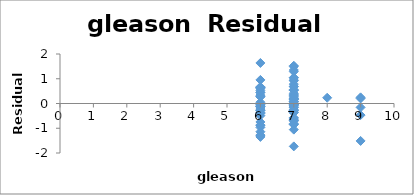
| Category | Series 0 |
|---|---|
| 6.0 | -1.305 |
| 6.0 | -0.887 |
| 7.0 | -0.706 |
| 6.0 | -0.747 |
| 6.0 | -1.35 |
| 6.0 | -0.042 |
| 6.0 | -1.141 |
| 6.0 | -1.273 |
| 6.0 | -0.12 |
| 6.0 | -0.259 |
| 6.0 | -0.182 |
| 6.0 | 0.437 |
| 7.0 | -0.853 |
| 7.0 | -0.572 |
| 7.0 | -0.659 |
| 6.0 | -0.491 |
| 7.0 | 0.173 |
| 6.0 | -0.966 |
| 6.0 | 0.27 |
| 6.0 | -0.135 |
| 6.0 | -0.368 |
| 7.0 | -1.055 |
| 6.0 | 0.639 |
| 7.0 | -0.843 |
| 6.0 | -0.064 |
| 6.0 | -0.286 |
| 7.0 | -0.153 |
| 7.0 | 0.194 |
| 7.0 | -0.235 |
| 6.0 | -0.399 |
| 6.0 | -0.06 |
| 6.0 | -0.867 |
| 6.0 | 0.051 |
| 6.0 | 0.653 |
| 6.0 | 0.953 |
| 7.0 | -0.685 |
| 8.0 | 0.232 |
| 7.0 | 1.05 |
| 7.0 | -1.733 |
| 7.0 | 0.414 |
| 9.0 | 0.248 |
| 7.0 | 0.094 |
| 6.0 | 0.277 |
| 7.0 | -0.017 |
| 7.0 | 0.087 |
| 7.0 | -0.033 |
| 9.0 | -1.512 |
| 7.0 | -0.008 |
| 6.0 | -0.117 |
| 6.0 | 0.456 |
| 7.0 | 0.327 |
| 6.0 | -0.273 |
| 7.0 | 0.532 |
| 7.0 | -0.298 |
| 7.0 | -0.592 |
| 7.0 | -0.101 |
| 7.0 | 1.035 |
| 6.0 | 0.535 |
| 7.0 | 0.695 |
| 7.0 | 0.186 |
| 6.0 | 0.615 |
| 7.0 | -0.677 |
| 9.0 | -0.157 |
| 7.0 | -0.812 |
| 6.0 | 0.337 |
| 7.0 | 0.223 |
| 7.0 | -0.048 |
| 7.0 | -0.078 |
| 6.0 | 1.638 |
| 7.0 | 0.172 |
| 7.0 | -0.271 |
| 7.0 | 0.918 |
| 7.0 | 0.29 |
| 9.0 | -0.469 |
| 7.0 | -0.372 |
| 7.0 | -0.371 |
| 7.0 | 0.18 |
| 7.0 | 0.073 |
| 7.0 | -0.017 |
| 7.0 | 0.357 |
| 7.0 | 1.352 |
| 7.0 | 0.538 |
| 7.0 | 0.004 |
| 9.0 | 0.204 |
| 7.0 | 0.946 |
| 7.0 | -0.279 |
| 6.0 | 0.673 |
| 7.0 | 0.675 |
| 7.0 | -0.146 |
| 7.0 | 0.784 |
| 6.0 | 0.657 |
| 7.0 | 0.059 |
| 7.0 | 0.562 |
| 7.0 | -0.021 |
| 7.0 | 1.526 |
| 7.0 | 1.29 |
| 7.0 | 1.491 |